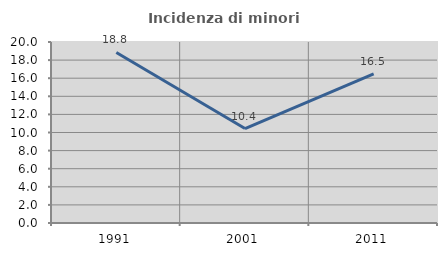
| Category | Incidenza di minori stranieri |
|---|---|
| 1991.0 | 18.841 |
| 2001.0 | 10.435 |
| 2011.0 | 16.489 |